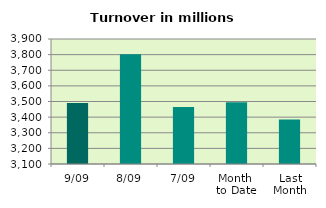
| Category | Series 0 |
|---|---|
| 9/09 | 3490.858 |
| 8/09 | 3801.74 |
| 7/09 | 3465.195 |
| Month 
to Date | 3495.392 |
| Last
Month | 3384.596 |